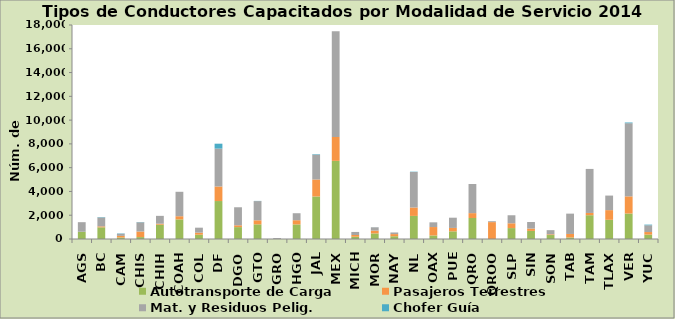
| Category | Autotransporte de Carga | Pasajeros Terrestres | Mat. y Residuos Pelig. | Chofer Guía |
|---|---|---|---|---|
| AGS | 608 | 0 | 807 | 0 |
| BC | 982 | 82 | 748 | 31 |
| CAM | 126 | 137 | 178 | 29 |
| CHIS | 161 | 470 | 774 | 20 |
| CHIH | 1203 | 85 | 659 | 0 |
| COAH | 1649 | 267 | 2055 | 0 |
| COL | 360 | 174 | 418 | 0 |
| DF | 3193 | 1225 | 3185 | 414 |
| DGO | 1000 | 153 | 1517 | 0 |
| GTO | 1234 | 340 | 1615 | 14 |
| GRO | 0 | 0 | 74 | 0 |
| HGO | 1227 | 353 | 588 | 0 |
| JAL | 3577 | 1430 | 2087 | 42 |
| MEX | 6571 | 2010 | 8895 | 0 |
| MICH | 190 | 145 | 258 | 0 |
| MOR | 470 | 236 | 279 | 4 |
| NAY | 231 | 182 | 137 | 0 |
| NL | 1942 | 708 | 2986 | 26 |
| OAX | 298 | 708 | 396 | 0 |
| PUE | 645 | 286 | 861 | 0 |
| QRO | 1767 | 410 | 2448 | 0 |
| QROO | 0 | 1420 | 75 | 0 |
| SLP | 918 | 403 | 676 | 0 |
| SIN | 680 | 198 | 551 | 1 |
| SON | 334 | 61 | 350 | 0 |
| TAB | 129 | 295 | 1710 | 0 |
| TAM | 2001 | 190 | 3703 | 0 |
| TLAX | 1613 | 816 | 1224 | 0 |
| VER | 2143 | 1444 | 6152 | 61 |
| YUC | 368 | 218 | 569 | 55 |